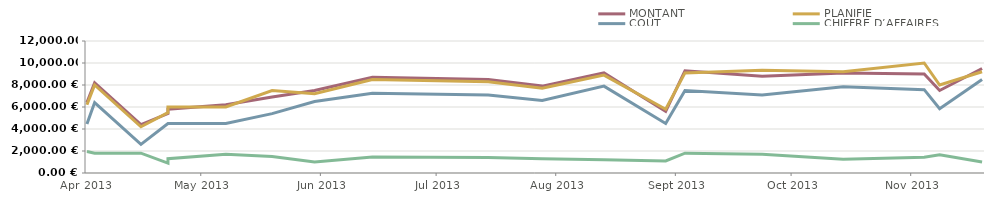
| Category | MONTANT | PLANIFIÉ | COÛT | CHIFFRE D’AFFAIRES |
|---|---|---|---|---|
| 2013-04-23 | 6400 | 6200 | 4450 | 1950 |
| 2013-04-25 | 8200 | 8000 | 6400 | 1800 |
| 2013-05-07 | 4400 | 4200 | 2600 | 1800 |
| 2013-05-14 | 5400 | 5500 | 4500 | 900 |
| 2013-05-14 | 5800 | 6000 | 4500 | 1300 |
| 2013-05-29 | 6200 | 6000 | 4500 | 1700 |
| 2013-06-10 | 6900 | 7500 | 5400 | 1500 |
| 2013-06-21 | 7500 | 7200 | 6500 | 1000 |
| 2013-07-06 | 8700 | 8500 | 7250 | 1450 |
| 2013-08-05 | 8500 | 8300 | 7100 | 1400 |
| 2013-08-19 | 7900 | 7700 | 6600 | 1300 |
| 2013-09-04 | 9100 | 8900 | 7900 | 1200 |
| 2013-09-20 | 5600 | 5800 | 4500 | 1100 |
| 2013-09-25 | 9300 | 9100 | 7500 | 1800 |
| 2013-10-15 | 8800 | 9350 | 7100 | 1700 |
| 2013-11-05 | 9100 | 9200 | 7850 | 1250 |
| 2013-11-26 | 9000 | 10000 | 7575 | 1425 |
| 2013-11-30 | 7500 | 8000 | 5850 | 1650 |
| 2013-12-11 | 9500 | 9200 | 8500 | 1000 |